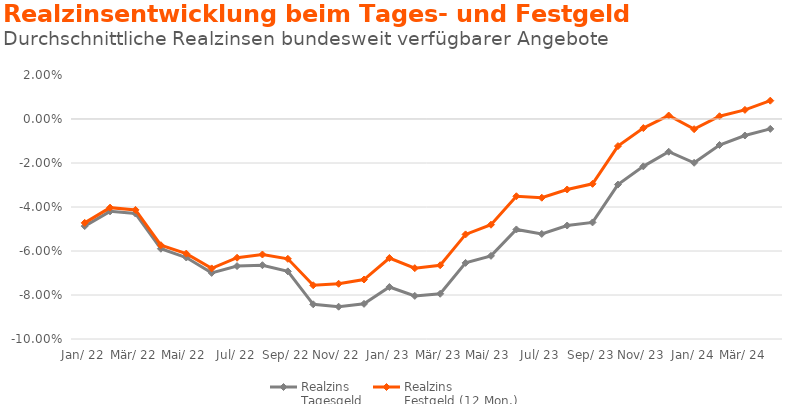
| Category | Realzins
Tagesgeld | Realzins
Festgeld (12 Mon.) |
|---|---|---|
| Jan. 22 | -0.049 | -0.047 |
| Feb. 22 | -0.042 | -0.04 |
| Mrz. 22 | -0.043 | -0.041 |
| Apr. 22 | -0.059 | -0.057 |
| Mai. 22 | -0.063 | -0.061 |
| Jun. 22 | -0.07 | -0.068 |
| Jul. 22 | -0.067 | -0.063 |
| Aug. 22 | -0.066 | -0.062 |
| Sep. 22 | -0.069 | -0.064 |
| Okt. 22 | -0.084 | -0.076 |
| Nov. 22 | -0.085 | -0.075 |
| Dez. 22 | -0.084 | -0.073 |
| Jan. 23 | -0.076 | -0.063 |
| Feb. 23 | -0.08 | -0.068 |
| Mrz. 23 | -0.079 | -0.066 |
| Apr. 23 | -0.065 | -0.052 |
| Mai. 23 | -0.062 | -0.048 |
| Jun. 23 | -0.05 | -0.035 |
| Jul. 23 | -0.052 | -0.036 |
| Aug. 23 | -0.048 | -0.032 |
| Sep. 23 | -0.047 | -0.029 |
| Okt. 23 | -0.03 | -0.012 |
| Nov. 23 | -0.022 | -0.004 |
| Dez. 23 | -0.015 | 0.002 |
| Jan. 24 | -0.02 | -0.005 |
| Feb. 24 | -0.012 | 0.001 |
| Mrz. 24 | -0.008 | 0.004 |
| Akt. | -0.004 | 0.008 |